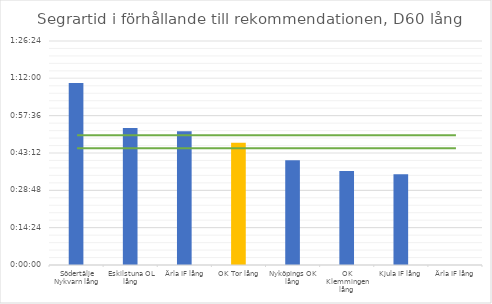
| Category | D60 tid |
|---|---|
| Södertälje Nykvarn lång | 0.049 |
| Eskilstuna OL lång | 0.037 |
| Ärla IF lång | 0.036 |
| OK Tor lång | 0.033 |
| Nyköpings OK lång | 0.028 |
| OK Klemmingen lång | 0.025 |
| Kjula IF lång | 0.024 |
| Ärla IF lång | 0 |